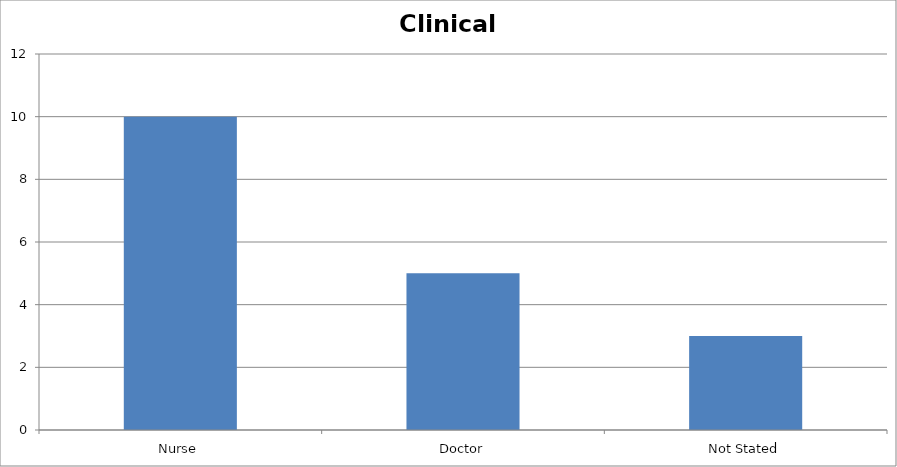
| Category | Series 0 |
|---|---|
| Nurse | 10 |
| Doctor | 5 |
| Not Stated | 3 |